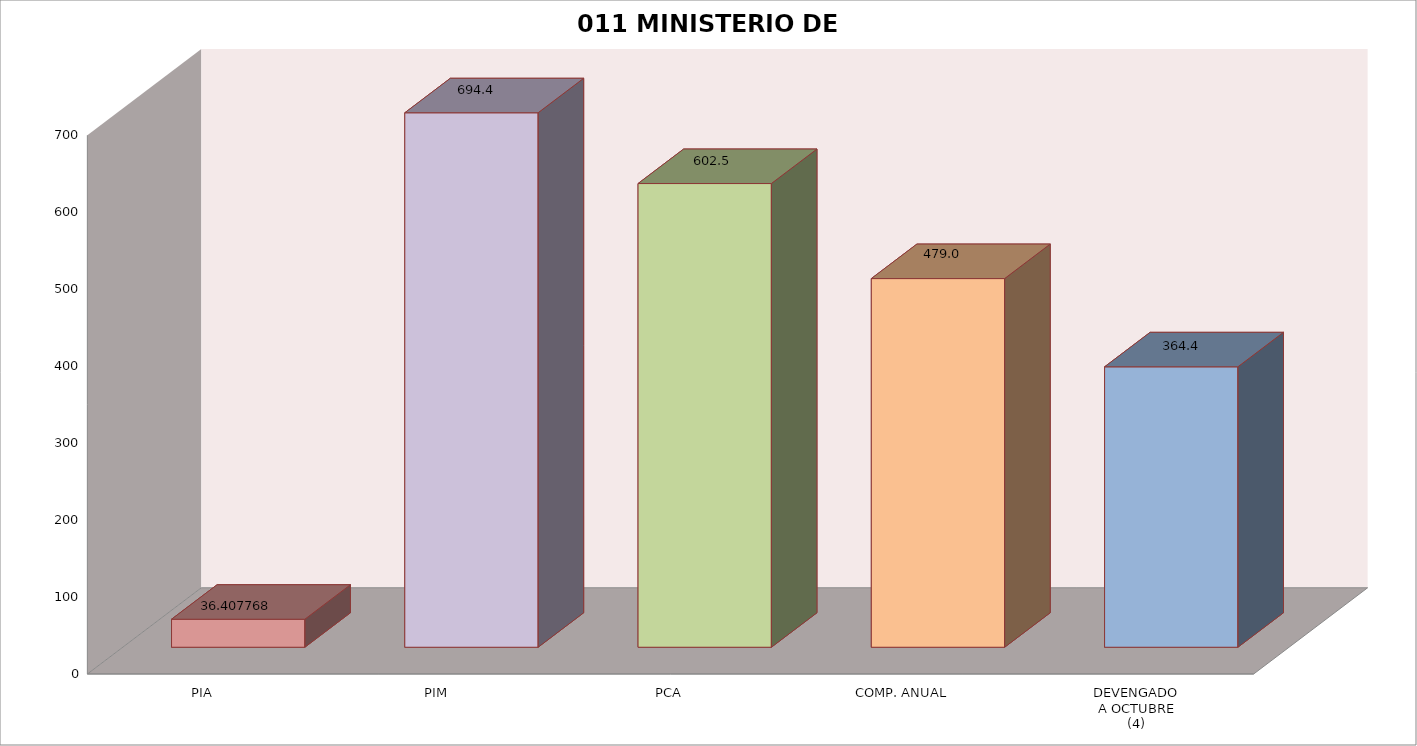
| Category | 011 MINISTERIO DE SALUD |
|---|---|
| PIA | 36.408 |
| PIM | 694.439 |
| PCA | 602.503 |
| COMP. ANUAL | 479.023 |
| DEVENGADO
A OCTUBRE
(4) | 364.355 |